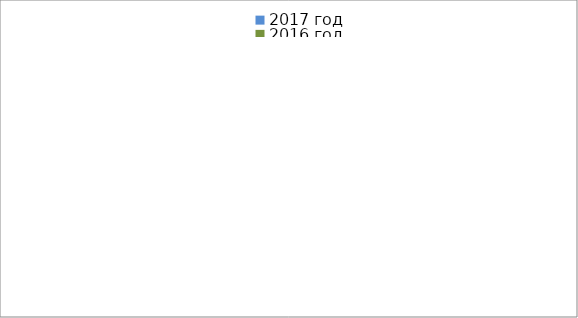
| Category | 2017 год | 2016 год |
|---|---|---|
|  - поджог | 11 | 29 |
|  - неосторожное обращение с огнём | 4 | 17 |
|  - НПТЭ электрооборудования | 11 | 11 |
|  - НПУ и Э печей | 28 | 27 |
|  - НПУ и Э транспортных средств | 37 | 17 |
|   -Шалость с огнем детей | 3 | 5 |
|  -НППБ при эксплуатации эл.приборов | 21 | 6 |
|  - курение | 23 | 11 |
| - прочие | 52 | 58 |
| - не установленные причины | 0 | 11 |